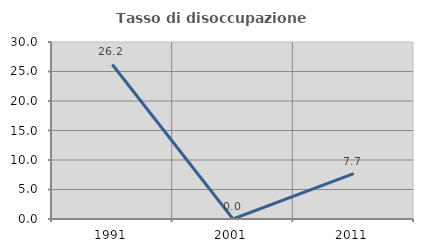
| Category | Tasso di disoccupazione giovanile  |
|---|---|
| 1991.0 | 26.19 |
| 2001.0 | 0 |
| 2011.0 | 7.692 |